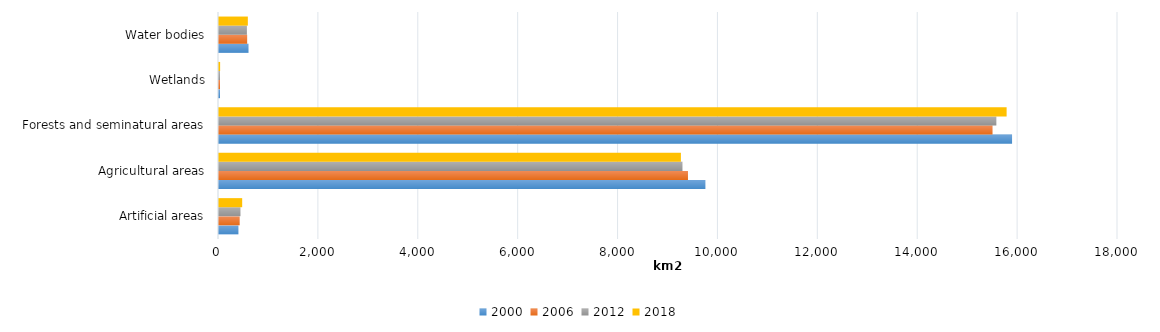
| Category | 2000 | 2006 | 2012 | 2018 |
|---|---|---|---|---|
| Artificial areas | 389 | 414 | 430 | 464.213 |
| Agricultural areas | 9739 | 9390 | 9279.76 | 9248.273 |
| Forests and seminatural areas | 15879 | 15488 | 15564.489 | 15769.882 |
| Wetlands | 20 | 20 | 19.5 | 22.466 |
| Water bodies | 591 | 564 | 558.56 | 577.361 |